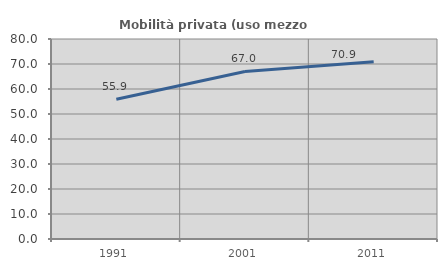
| Category | Mobilità privata (uso mezzo privato) |
|---|---|
| 1991.0 | 55.903 |
| 2001.0 | 67.023 |
| 2011.0 | 70.933 |